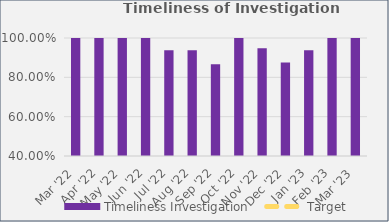
| Category | Timeliness Investigation |
|---|---|
| Mar '22 | 1 |
| Apr '22 | 1 |
| May '22 | 1 |
| Jun '22 | 1 |
| Jul '22 | 0.938 |
| Aug '22 | 0.938 |
| Sep '22 | 0.867 |
| Oct '22 | 1 |
| Nov '22 | 0.947 |
| Dec '22 | 0.875 |
| Jan '23 | 0.938 |
| Feb '23 | 1 |
| Mar '23 | 1 |